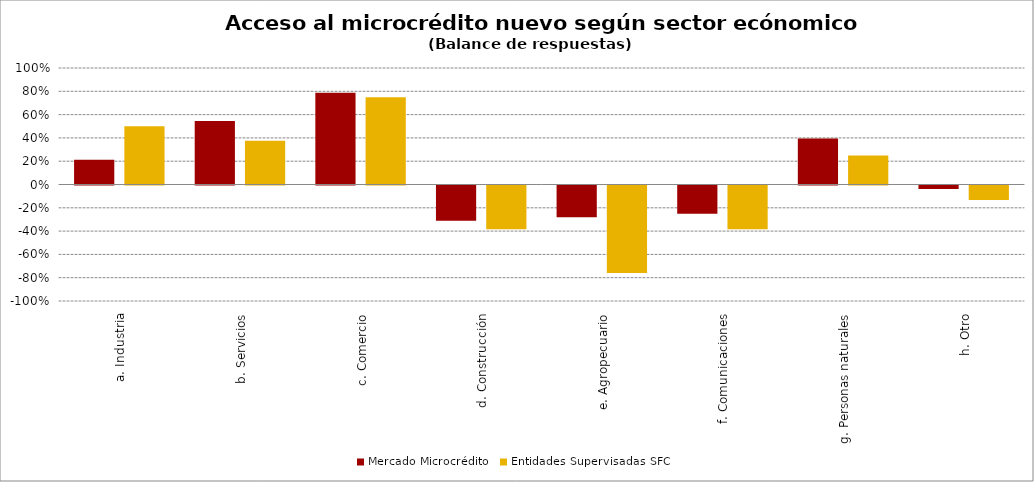
| Category | Mercado Microcrédito | Entidades Supervisadas SFC |
|---|---|---|
| a. Industria | 0.212 | 0.5 |
| b. Servicios | 0.545 | 0.375 |
| c. Comercio | 0.788 | 0.75 |
| d. Construcción | -0.303 | -0.375 |
| e. Agropecuario | -0.273 | -0.75 |
| f. Comunicaciones | -0.242 | -0.375 |
| g. Personas naturales | 0.394 | 0.25 |
| h. Otro | -0.03 | -0.125 |